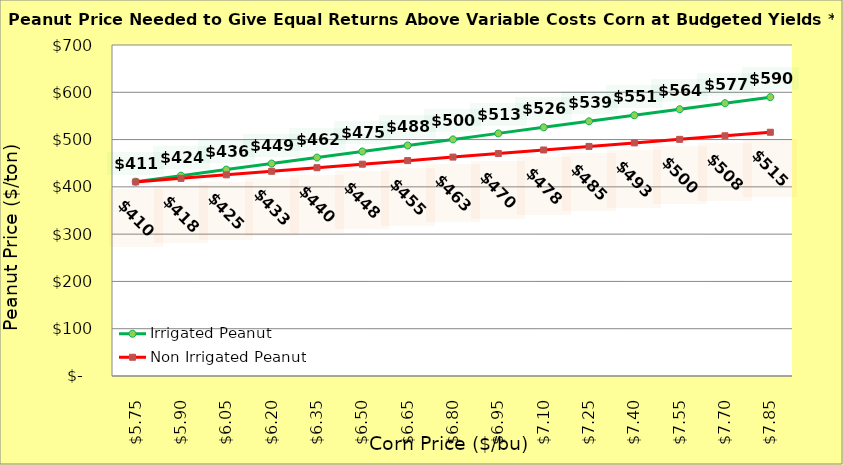
| Category | Irrigated Peanut | Non Irrigated Peanut |
|---|---|---|
| 5.749999999999997 | 410.956 | 410.45 |
| 5.899999999999998 | 423.722 | 417.95 |
| 6.049999999999998 | 436.488 | 425.45 |
| 6.199999999999998 | 449.254 | 432.95 |
| 6.349999999999999 | 462.02 | 440.45 |
| 6.499999999999999 | 474.786 | 447.95 |
| 6.6499999999999995 | 487.552 | 455.45 |
| 6.8 | 500.318 | 462.95 |
| 6.95 | 513.083 | 470.45 |
| 7.1000000000000005 | 525.849 | 477.95 |
| 7.250000000000001 | 538.615 | 485.45 |
| 7.400000000000001 | 551.381 | 492.95 |
| 7.550000000000002 | 564.147 | 500.45 |
| 7.700000000000002 | 576.913 | 507.95 |
| 7.850000000000002 | 589.679 | 515.45 |